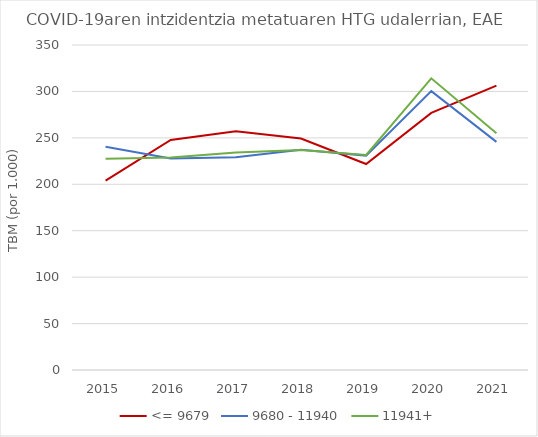
| Category | <= 9679 | 9680 - 11940 | 11941+ |
|---|---|---|---|
| 2015.0 | 203.857 | 240.447 | 227.56 |
| 2016.0 | 247.76 | 227.817 | 228.81 |
| 2017.0 | 257.072 | 229.109 | 234.232 |
| 2018.0 | 249.275 | 237.14 | 236.896 |
| 2019.0 | 221.792 | 230.874 | 231.554 |
| 2020.0 | 276.923 | 300.329 | 314.147 |
| 2021.0 | 306.287 | 245.692 | 254.941 |